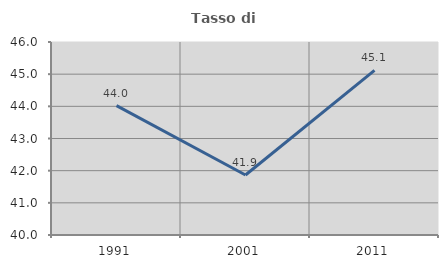
| Category | Tasso di occupazione   |
|---|---|
| 1991.0 | 44.02 |
| 2001.0 | 41.866 |
| 2011.0 | 45.12 |